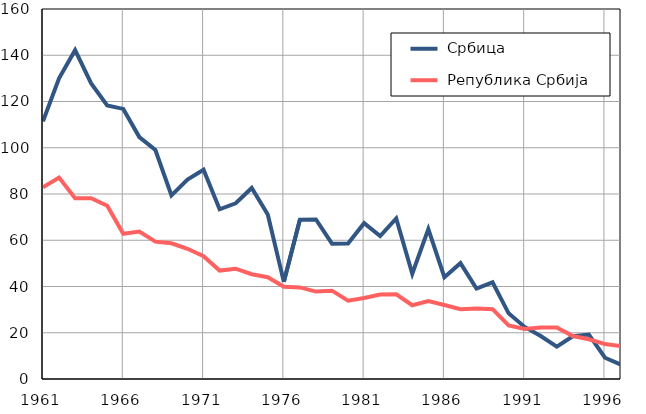
| Category |  Србица |  Република Србија |
|---|---|---|
| 1961.0 | 111.4 | 82.9 |
| 1962.0 | 130 | 87.1 |
| 1963.0 | 142.2 | 78.2 |
| 1964.0 | 127.8 | 78.2 |
| 1965.0 | 118.3 | 74.9 |
| 1966.0 | 116.8 | 62.8 |
| 1967.0 | 104.6 | 63.8 |
| 1968.0 | 99 | 59.4 |
| 1969.0 | 79.4 | 58.7 |
| 1970.0 | 86.2 | 56.3 |
| 1971.0 | 90.5 | 53.1 |
| 1972.0 | 73.4 | 46.9 |
| 1973.0 | 76 | 47.7 |
| 1974.0 | 82.6 | 45.3 |
| 1975.0 | 71.1 | 44 |
| 1976.0 | 42 | 39.9 |
| 1977.0 | 68.9 | 39.6 |
| 1978.0 | 69 | 37.8 |
| 1979.0 | 58.5 | 38.2 |
| 1980.0 | 58.6 | 33.9 |
| 1981.0 | 67.4 | 35 |
| 1982.0 | 61.8 | 36.5 |
| 1983.0 | 69.4 | 36.6 |
| 1984.0 | 45.5 | 31.9 |
| 1985.0 | 64.8 | 33.7 |
| 1986.0 | 44 | 32 |
| 1987.0 | 50.1 | 30.2 |
| 1988.0 | 39.1 | 30.5 |
| 1989.0 | 41.8 | 30.2 |
| 1990.0 | 28.4 | 23.2 |
| 1991.0 | 22.5 | 21.6 |
| 1992.0 | 18.6 | 22.3 |
| 1993.0 | 14 | 22.3 |
| 1994.0 | 18.5 | 18.6 |
| 1995.0 | 19.2 | 17.2 |
| 1996.0 | 9.2 | 15.1 |
| 1997.0 | 6.2 | 14.2 |